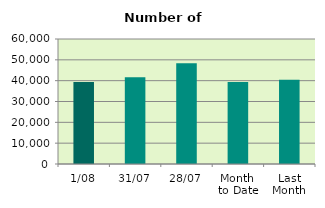
| Category | Series 0 |
|---|---|
| 1/08 | 39398 |
| 31/07 | 41602 |
| 28/07 | 48418 |
| Month 
to Date | 39398 |
| Last
Month | 40410.857 |